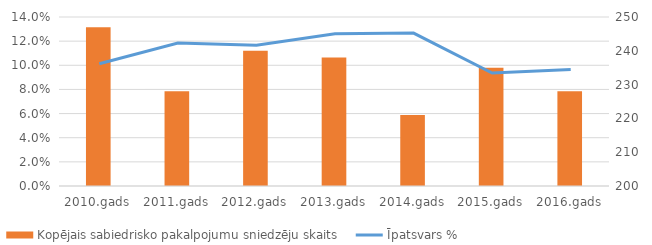
| Category | Kopējais sabiedrisko pakalpojumu sniedzēju skaits |
|---|---|
| 2010.gads | 247 |
| 2011.gads | 228 |
| 2012.gads | 240 |
| 2013.gads | 238 |
| 2014.gads | 221 |
| 2015.gads | 235 |
| 2016.gads | 228 |